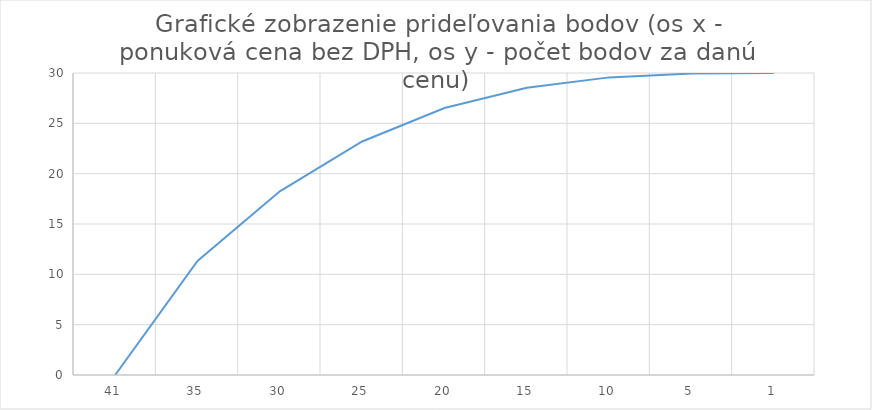
| Category | Series 0 |
|---|---|
| 41.0 | 0 |
| 35.0 | 11.337 |
| 30.0 | 18.247 |
| 25.0 | 23.199 |
| 20.0 | 26.518 |
| 15.0 | 28.531 |
| 10.0 | 29.565 |
| 5.0 | 29.946 |
| 1.0 | 30 |